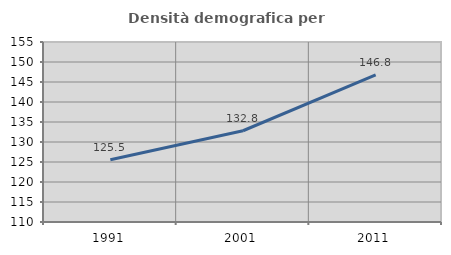
| Category | Densità demografica |
|---|---|
| 1991.0 | 125.545 |
| 2001.0 | 132.814 |
| 2011.0 | 146.772 |